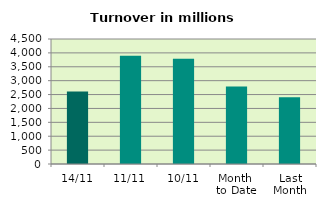
| Category | Series 0 |
|---|---|
| 14/11 | 2609.148 |
| 11/11 | 3894.325 |
| 10/11 | 3786.141 |
| Month 
to Date | 2794.442 |
| Last
Month | 2399.244 |